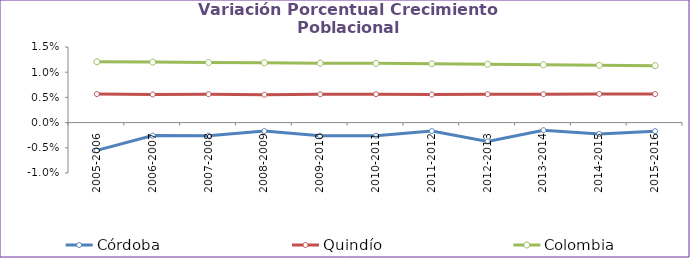
| Category | Córdoba | Quindío | Colombia |
|---|---|---|---|
| 2005-2006 | -0.006 | 0.006 | 0.012 |
| 2006-2007 | -0.003 | 0.006 | 0.012 |
| 2007-2008 | -0.003 | 0.006 | 0.012 |
| 2008-2009 | -0.002 | 0.006 | 0.012 |
| 2009-2010 | -0.003 | 0.006 | 0.012 |
| 2010-2011 | -0.003 | 0.006 | 0.012 |
| 2011-2012 | -0.002 | 0.006 | 0.012 |
| 2012-2013 | -0.004 | 0.006 | 0.012 |
| 2013-2014 | -0.002 | 0.006 | 0.011 |
| 2014-2015 | -0.002 | 0.006 | 0.011 |
| 2015-2016 | -0.002 | 0.006 | 0.011 |